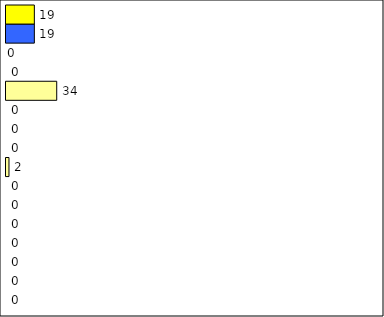
| Category | -2 | -1 | 0 | 1 | 2 | 3 | 4 | 5 | 6 | 7 | 8 | 9 | 10 | 11 | 12 | Perfect Round |
|---|---|---|---|---|---|---|---|---|---|---|---|---|---|---|---|---|
| 0 | 0 | 0 | 0 | 0 | 0 | 0 | 0 | 2 | 0 | 0 | 0 | 34 | 0 | 0 | 19 | 19 |